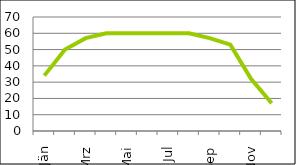
| Category | Series 0 |
|---|---|
| Jän | 34 |
| Feb | 50 |
| Mrz | 57 |
| Apr | 60 |
| Mai | 60 |
| Jun | 60 |
| Jul | 60 |
| Aug | 60 |
| Sep | 57 |
| Okt | 53 |
| Nov | 32 |
| Dez | 17 |